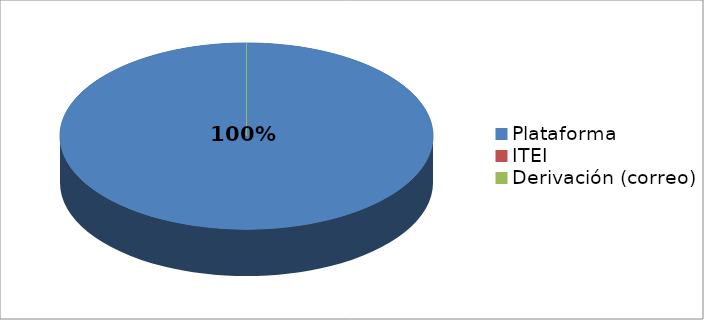
| Category | Series 0 | Series 1 |
|---|---|---|
| Plataforma | 9 | 1 |
| ITEI | 0 | 0 |
| Derivación (correo) | 0 | 0 |